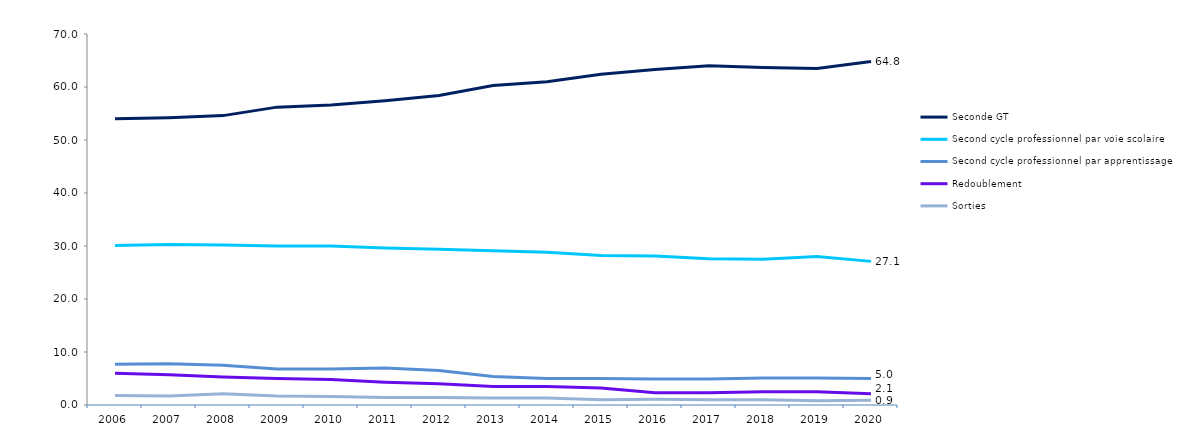
| Category | Seconde GT | Second cycle professionnel par voie scolaire | Second cycle professionnel par apprentissage | Redoublement  | Sorties |
|---|---|---|---|---|---|
| 2006.0 | 54 | 30.1 | 7.7 | 6 | 1.8 |
| 2007.0 | 54.2 | 30.3 | 7.8 | 5.7 | 1.7 |
| 2008.0 | 54.6 | 30.2 | 7.5 | 5.3 | 2.1 |
| 2009.0 | 56.2 | 30 | 6.8 | 5 | 1.7 |
| 2010.0 | 56.6 | 30 | 6.8 | 4.8 | 1.6 |
| 2011.0 | 57.4 | 29.6 | 7 | 4.3 | 1.4 |
| 2012.0 | 58.4 | 29.4 | 6.5 | 4 | 1.4 |
| 2013.0 | 60.3 | 29.1 | 5.4 | 3.5 | 1.3 |
| 2014.0 | 61 | 28.8 | 5 | 3.5 | 1.3 |
| 2015.0 | 62.4 | 28.2 | 5 | 3.2 | 1 |
| 2016.0 | 63.3 | 28.1 | 4.9 | 2.3 | 1.1 |
| 2017.0 | 64 | 27.6 | 4.9 | 2.3 | 1 |
| 2018.0 | 63.7 | 27.5 | 5.1 | 2.5 | 1 |
| 2019.0 | 63.5 | 28 | 5.1 | 2.5 | 0.8 |
| 2020.0 | 64.8 | 27.1 | 5 | 2.1 | 0.9 |